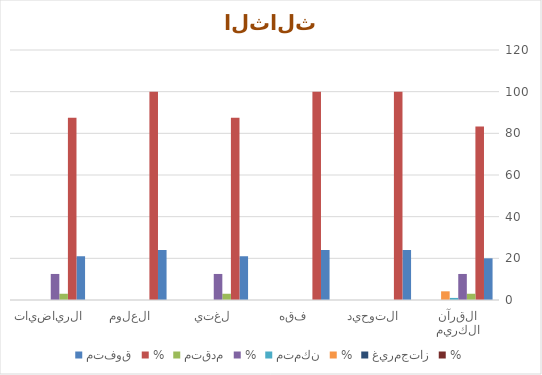
| Category | متفوق | % | متقدم | متمكن | غيرمجتاز |
|---|---|---|---|---|---|
| القرآن الكريم | 20 | 0 | 3 | 1 | 0 |
| التوحيد  | 24 | 0 | 0 | 0 | 0 |
| فقه | 24 | 0 | 0 | 0 | 0 |
| لغتي | 21 | 0 | 3 | 0 | 0 |
| العلوم | 24 | 0 | 0 | 0 | 0 |
| الرياضيات | 21 | 0 | 3 | 0 | 0 |